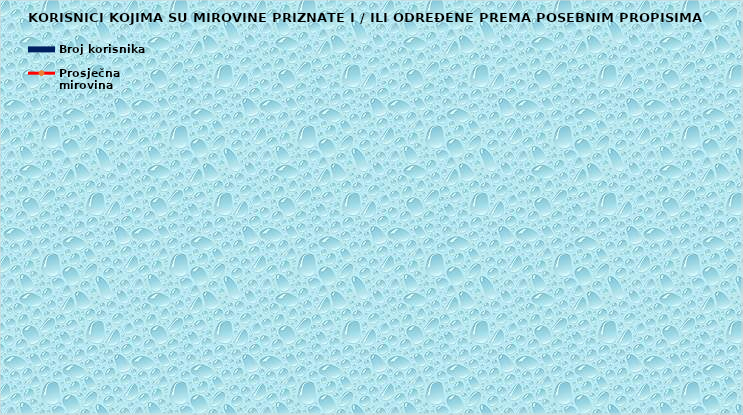
| Category | Broj korisnika |
|---|---|
|      a) radnici na poslovima ovlaštenih službenih osoba u tijelima unutarnjih 
poslova i pravosuđa, kojima je pravo na mirovinu priznato prema propisima
koji su bili na snazi do stupanja na snagu Zakona o pravima iz mirovinskog
osiguranja DVO, PS i OSO | 7464 |
|      b) radnici na  poslovima policijskih službenika, ovlaštenih službenih osoba pravosuđa i službene osobe s posebnim dužnostima i ovlastima u sigurnosno obavještajnom sustavu RH koji su pravo na mirovinu ostvarili prema Zakonu o pravima DVO, PS i OSO | 9213 |
|      c) radnici na poslovima razminiranja | 642 |
| Korisnici koji pravo na mirovinu ostvaruju prema Zakonu o vatrogastvu (NN 125/19)* | 299 |
| Djelatne vojne osobe - DVO  | 16084 |
| Pripadnici Hrvatske domovinske vojske od 1941. do 1945. godine | 2283 |
| Bivši politički zatvorenici | 2246 |
| Hrvatski branitelji iz Domovinskog rata - ZOHBDR | 71177 |
| Mirovine priznate prema općim propisima, a određene prema
ZOHBDR - u iz 2017. (čl. 27., 35., 48. i 49. stavak 2.)  | 54866 |
| Pripadnici bivše Jugoslavenske narodne armije - JNA | 4038 |
| Pripadnici bivše Jugoslavenske narodne armije - JNA - čl. 185 ZOMO | 159 |
| Sudionici Narodnooslobodilačkog rata - NOR | 5799 |
| Zastupnici u Hrvatskom saboru, članovi Vlade, suci Ustavnog suda i glavni državni revizor  | 686 |
| Članovi Izvršnog vijeća Sabora, Saveznog izvršnog vijeća i administrativno umirovljeni javni službenici | 70 |
| Bivši službenici u saveznim tijelima bivše SFRJ - članak 38. ZOMO | 21 |
| Redoviti članovi Hrvatske akademije znanosti i umjetnosti - HAZU | 127 |
| Radnici u Istarskim ugljenokopima "Tupljak" d.d. Labin  | 246 |
| Radnici profesionalno izloženi azbestu | 833 |
| Osiguranici - članovi posade broda u međunarodnoj plovidbi i nacionalnoj plovidbi - članak 129. a stavak 2. Pomorskog zakonika | 204 |
| Pripadnici Hrvatskog vijeća obrane  - HVO  | 6767 |